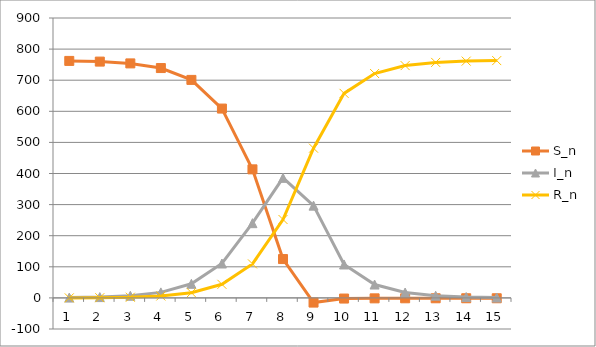
| Category | S_n | I_n | R_n |
|---|---|---|---|
| 0 | 762 | 1 | 0 |
| 1 | 759.788 | 2.618 | 0.594 |
| 2 | 754.011 | 6.839 | 2.15 |
| 3 | 739.038 | 17.75 | 6.212 |
| 4 | 700.95 | 45.293 | 16.757 |
| 5 | 608.769 | 110.568 | 43.663 |
| 6 | 413.332 | 240.322 | 109.346 |
| 7 | 124.918 | 385.974 | 252.109 |
| 8 | -15.075 | 296.679 | 481.396 |
| 9 | -2.089 | 107.452 | 657.638 |
| 10 | -1.437 | 42.968 | 721.469 |
| 11 | -1.258 | 17.264 | 746.994 |
| 12 | -1.195 | 6.945 | 757.25 |
| 13 | -1.171 | 2.795 | 761.376 |
| 14 | -1.161 | 1.125 | 763.036 |